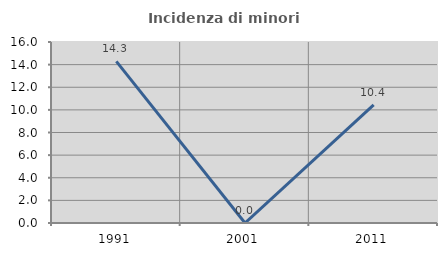
| Category | Incidenza di minori stranieri |
|---|---|
| 1991.0 | 14.286 |
| 2001.0 | 0 |
| 2011.0 | 10.448 |